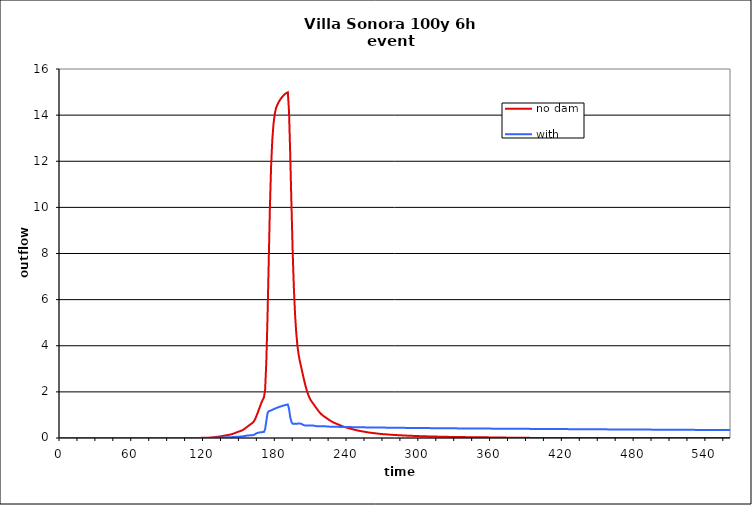
| Category | no dam | with dam |
|---|---|---|
| 0.0 | 0 | 0 |
| 1.0 | 0 | 0 |
| 2.0 | 0 | 0 |
| 3.0 | 0 | 0 |
| 4.0 | 0 | 0 |
| 5.0 | 0 | 0 |
| 6.0 | 0 | 0 |
| 7.0 | 0 | 0 |
| 8.0 | 0 | 0 |
| 9.0 | 0 | 0 |
| 10.0 | 0 | 0 |
| 11.0 | 0 | 0 |
| 12.0 | 0 | 0 |
| 13.0 | 0 | 0 |
| 14.0 | 0 | 0 |
| 15.0 | 0 | 0 |
| 16.0 | 0 | 0 |
| 17.0 | 0 | 0 |
| 18.0 | 0 | 0 |
| 19.0 | 0 | 0 |
| 20.0 | 0 | 0 |
| 21.0 | 0 | 0 |
| 22.0 | 0 | 0 |
| 23.0 | 0 | 0 |
| 24.0 | 0 | 0 |
| 25.0 | 0 | 0 |
| 26.0 | 0 | 0 |
| 27.0 | 0 | 0 |
| 28.0 | 0 | 0 |
| 29.0 | 0 | 0 |
| 30.0 | 0 | 0 |
| 31.0 | 0 | 0 |
| 32.0 | 0 | 0 |
| 33.0 | 0 | 0 |
| 34.0 | 0 | 0 |
| 35.0 | 0 | 0 |
| 36.0 | 0 | 0 |
| 37.0 | 0 | 0 |
| 38.0 | 0 | 0 |
| 39.0 | 0 | 0 |
| 40.0 | 0 | 0 |
| 41.0 | 0 | 0 |
| 42.0 | 0 | 0 |
| 43.0 | 0 | 0 |
| 44.0 | 0 | 0 |
| 45.0 | 0 | 0 |
| 46.0 | 0 | 0 |
| 47.0 | 0 | 0 |
| 48.0 | 0 | 0 |
| 49.0 | 0 | 0 |
| 50.0 | 0 | 0 |
| 51.0 | 0 | 0 |
| 52.0 | 0 | 0 |
| 53.0 | 0 | 0 |
| 54.0 | 0 | 0 |
| 55.0 | 0 | 0 |
| 56.0 | 0 | 0 |
| 57.0 | 0 | 0 |
| 58.0 | 0 | 0 |
| 59.0 | 0 | 0 |
| 60.0 | 0 | 0 |
| 61.0 | 0 | 0 |
| 62.0 | 0 | 0 |
| 63.0 | 0 | 0 |
| 64.0 | 0 | 0 |
| 65.0 | 0 | 0 |
| 66.0 | 0 | 0 |
| 67.0 | 0 | 0 |
| 68.0 | 0 | 0 |
| 69.0 | 0 | 0 |
| 70.0 | 0 | 0 |
| 71.0 | 0 | 0 |
| 72.0 | 0 | 0 |
| 73.0 | 0 | 0 |
| 74.0 | 0 | 0 |
| 75.0 | 0 | 0 |
| 76.0 | 0 | 0 |
| 77.0 | 0 | 0 |
| 78.0 | 0 | 0 |
| 79.0 | 0 | 0 |
| 80.0 | 0 | 0 |
| 81.0 | 0 | 0 |
| 82.0 | 0 | 0 |
| 83.0 | 0 | 0 |
| 84.0 | 0 | 0 |
| 85.0 | 0 | 0 |
| 86.0 | 0 | 0 |
| 87.0 | 0 | 0 |
| 88.0 | 0 | 0 |
| 89.0 | 0 | 0 |
| 90.0 | 0 | 0 |
| 91.0 | 0 | 0 |
| 92.0 | 0 | 0 |
| 93.0 | 0 | 0 |
| 94.0 | 0 | 0 |
| 95.0 | 0 | 0 |
| 96.0 | 0 | 0 |
| 97.0 | 0 | 0 |
| 98.0 | 0 | 0 |
| 99.0 | 0 | 0 |
| 100.0 | 0 | 0 |
| 101.0 | 0 | 0 |
| 102.0 | 0 | 0 |
| 103.0 | 0 | 0 |
| 104.0 | 0 | 0 |
| 105.0 | 0 | 0 |
| 106.0 | 0 | 0 |
| 107.0 | 0 | 0 |
| 108.0 | 0 | 0 |
| 109.0 | 0 | 0 |
| 110.0 | 0 | 0 |
| 111.0 | 0 | 0 |
| 112.0 | 0 | 0 |
| 113.0 | 0 | 0 |
| 114.0 | 0 | 0 |
| 115.0 | 0 | 0 |
| 116.0 | 0.001 | 0 |
| 117.0 | 0.005 | 0 |
| 118.0 | 0.007 | 0 |
| 119.0 | 0.008 | 0 |
| 120.0 | 0.009 | 0.001 |
| 121.0 | 0.01 | 0.001 |
| 122.0 | 0.011 | 0.001 |
| 123.0 | 0.013 | 0.002 |
| 124.0 | 0.016 | 0.002 |
| 125.0 | 0.019 | 0.003 |
| 126.0 | 0.023 | 0.004 |
| 127.0 | 0.028 | 0.006 |
| 128.0 | 0.034 | 0.007 |
| 129.0 | 0.04 | 0.009 |
| 130.0 | 0.046 | 0.011 |
| 131.0 | 0.053 | 0.013 |
| 132.0 | 0.059 | 0.014 |
| 133.0 | 0.066 | 0.016 |
| 134.0 | 0.074 | 0.018 |
| 135.0 | 0.082 | 0.02 |
| 136.0 | 0.092 | 0.022 |
| 137.0 | 0.102 | 0.024 |
| 138.0 | 0.112 | 0.026 |
| 139.0 | 0.121 | 0.027 |
| 140.0 | 0.13 | 0.029 |
| 141.0 | 0.139 | 0.031 |
| 142.0 | 0.15 | 0.033 |
| 143.0 | 0.164 | 0.037 |
| 144.0 | 0.18 | 0.04 |
| 145.0 | 0.2 | 0.045 |
| 146.0 | 0.22 | 0.049 |
| 147.0 | 0.241 | 0.053 |
| 148.0 | 0.261 | 0.056 |
| 149.0 | 0.279 | 0.059 |
| 150.0 | 0.296 | 0.061 |
| 151.0 | 0.315 | 0.064 |
| 152.0 | 0.337 | 0.07 |
| 153.0 | 0.368 | 0.078 |
| 154.0 | 0.405 | 0.088 |
| 155.0 | 0.446 | 0.097 |
| 156.0 | 0.486 | 0.105 |
| 157.0 | 0.525 | 0.111 |
| 158.0 | 0.564 | 0.115 |
| 159.0 | 0.602 | 0.118 |
| 160.0 | 0.637 | 0.121 |
| 161.0 | 0.682 | 0.129 |
| 162.0 | 0.753 | 0.149 |
| 163.0 | 0.86 | 0.177 |
| 164.0 | 0.988 | 0.206 |
| 165.0 | 1.122 | 0.227 |
| 166.0 | 1.264 | 0.238 |
| 167.0 | 1.407 | 0.245 |
| 168.0 | 1.54 | 0.251 |
| 169.0 | 1.66 | 0.257 |
| 170.0 | 1.763 | 0.262 |
| 171.0 | 2.086 | 0.383 |
| 172.0 | 3.307 | 0.732 |
| 173.0 | 5.241 | 1.079 |
| 174.0 | 7.619 | 1.162 |
| 175.0 | 10.007 | 1.179 |
| 176.0 | 11.795 | 1.198 |
| 177.0 | 12.93 | 1.22 |
| 178.0 | 13.618 | 1.244 |
| 179.0 | 14.037 | 1.268 |
| 180.0 | 14.281 | 1.291 |
| 181.0 | 14.426 | 1.312 |
| 182.0 | 14.532 | 1.332 |
| 183.0 | 14.622 | 1.351 |
| 184.0 | 14.7 | 1.368 |
| 185.0 | 14.774 | 1.385 |
| 186.0 | 14.836 | 1.401 |
| 187.0 | 14.888 | 1.416 |
| 188.0 | 14.932 | 1.429 |
| 189.0 | 14.965 | 1.441 |
| 190.0 | 14.99 | 1.453 |
| 191.0 | 14.126 | 1.257 |
| 192.0 | 12.256 | 0.9 |
| 193.0 | 10.151 | 0.695 |
| 194.0 | 8.138 | 0.624 |
| 195.0 | 6.538 | 0.611 |
| 196.0 | 5.378 | 0.614 |
| 197.0 | 4.569 | 0.619 |
| 198.0 | 4.008 | 0.623 |
| 199.0 | 3.617 | 0.626 |
| 200.0 | 3.335 | 0.629 |
| 201.0 | 3.11 | 0.619 |
| 202.0 | 2.874 | 0.592 |
| 203.0 | 2.643 | 0.565 |
| 204.0 | 2.421 | 0.548 |
| 205.0 | 2.215 | 0.541 |
| 206.0 | 2.033 | 0.541 |
| 207.0 | 1.88 | 0.542 |
| 208.0 | 1.755 | 0.543 |
| 209.0 | 1.655 | 0.544 |
| 210.0 | 1.575 | 0.545 |
| 211.0 | 1.505 | 0.542 |
| 212.0 | 1.431 | 0.532 |
| 213.0 | 1.356 | 0.521 |
| 214.0 | 1.282 | 0.514 |
| 215.0 | 1.212 | 0.51 |
| 216.0 | 1.145 | 0.508 |
| 217.0 | 1.085 | 0.508 |
| 218.0 | 1.032 | 0.508 |
| 219.0 | 0.986 | 0.509 |
| 220.0 | 0.947 | 0.51 |
| 221.0 | 0.911 | 0.508 |
| 222.0 | 0.876 | 0.504 |
| 223.0 | 0.839 | 0.498 |
| 224.0 | 0.803 | 0.494 |
| 225.0 | 0.768 | 0.491 |
| 226.0 | 0.736 | 0.49 |
| 227.0 | 0.706 | 0.489 |
| 228.0 | 0.678 | 0.489 |
| 229.0 | 0.653 | 0.49 |
| 230.0 | 0.631 | 0.49 |
| 231.0 | 0.61 | 0.489 |
| 232.0 | 0.589 | 0.486 |
| 233.0 | 0.568 | 0.483 |
| 234.0 | 0.546 | 0.48 |
| 235.0 | 0.525 | 0.478 |
| 236.0 | 0.504 | 0.477 |
| 237.0 | 0.486 | 0.476 |
| 238.0 | 0.468 | 0.476 |
| 239.0 | 0.452 | 0.476 |
| 240.0 | 0.438 | 0.476 |
| 241.0 | 0.424 | 0.476 |
| 242.0 | 0.41 | 0.474 |
| 243.0 | 0.396 | 0.472 |
| 244.0 | 0.382 | 0.47 |
| 245.0 | 0.368 | 0.468 |
| 246.0 | 0.354 | 0.467 |
| 247.0 | 0.342 | 0.467 |
| 248.0 | 0.33 | 0.466 |
| 249.0 | 0.319 | 0.466 |
| 250.0 | 0.309 | 0.466 |
| 251.0 | 0.3 | 0.465 |
| 252.0 | 0.29 | 0.464 |
| 253.0 | 0.281 | 0.463 |
| 254.0 | 0.271 | 0.461 |
| 255.0 | 0.262 | 0.46 |
| 256.0 | 0.253 | 0.459 |
| 257.0 | 0.244 | 0.459 |
| 258.0 | 0.236 | 0.458 |
| 259.0 | 0.229 | 0.458 |
| 260.0 | 0.222 | 0.458 |
| 261.0 | 0.216 | 0.457 |
| 262.0 | 0.21 | 0.456 |
| 263.0 | 0.204 | 0.455 |
| 264.0 | 0.198 | 0.454 |
| 265.0 | 0.191 | 0.453 |
| 266.0 | 0.185 | 0.453 |
| 267.0 | 0.18 | 0.452 |
| 268.0 | 0.175 | 0.451 |
| 269.0 | 0.17 | 0.451 |
| 270.0 | 0.166 | 0.451 |
| 271.0 | 0.162 | 0.45 |
| 272.0 | 0.158 | 0.45 |
| 273.0 | 0.154 | 0.449 |
| 274.0 | 0.15 | 0.448 |
| 275.0 | 0.146 | 0.447 |
| 276.0 | 0.142 | 0.446 |
| 277.0 | 0.138 | 0.446 |
| 278.0 | 0.135 | 0.445 |
| 279.0 | 0.132 | 0.445 |
| 280.0 | 0.129 | 0.444 |
| 281.0 | 0.126 | 0.444 |
| 282.0 | 0.123 | 0.443 |
| 283.0 | 0.12 | 0.442 |
| 284.0 | 0.118 | 0.442 |
| 285.0 | 0.115 | 0.441 |
| 286.0 | 0.112 | 0.44 |
| 287.0 | 0.109 | 0.44 |
| 288.0 | 0.106 | 0.439 |
| 289.0 | 0.104 | 0.439 |
| 290.0 | 0.102 | 0.438 |
| 291.0 | 0.099 | 0.438 |
| 292.0 | 0.097 | 0.437 |
| 293.0 | 0.095 | 0.436 |
| 294.0 | 0.093 | 0.436 |
| 295.0 | 0.091 | 0.435 |
| 296.0 | 0.089 | 0.434 |
| 297.0 | 0.087 | 0.434 |
| 298.0 | 0.085 | 0.433 |
| 299.0 | 0.083 | 0.433 |
| 300.0 | 0.081 | 0.433 |
| 301.0 | 0.079 | 0.432 |
| 302.0 | 0.078 | 0.432 |
| 303.0 | 0.076 | 0.431 |
| 304.0 | 0.074 | 0.43 |
| 305.0 | 0.073 | 0.43 |
| 306.0 | 0.071 | 0.429 |
| 307.0 | 0.07 | 0.429 |
| 308.0 | 0.068 | 0.429 |
| 309.0 | 0.067 | 0.428 |
| 310.0 | 0.066 | 0.428 |
| 311.0 | 0.064 | 0.427 |
| 312.0 | 0.063 | 0.427 |
| 313.0 | 0.062 | 0.426 |
| 314.0 | 0.061 | 0.425 |
| 315.0 | 0.059 | 0.425 |
| 316.0 | 0.058 | 0.424 |
| 317.0 | 0.057 | 0.424 |
| 318.0 | 0.056 | 0.423 |
| 319.0 | 0.054 | 0.423 |
| 320.0 | 0.053 | 0.422 |
| 321.0 | 0.052 | 0.422 |
| 322.0 | 0.051 | 0.421 |
| 323.0 | 0.05 | 0.421 |
| 324.0 | 0.049 | 0.42 |
| 325.0 | 0.048 | 0.42 |
| 326.0 | 0.047 | 0.419 |
| 327.0 | 0.046 | 0.419 |
| 328.0 | 0.045 | 0.419 |
| 329.0 | 0.044 | 0.418 |
| 330.0 | 0.044 | 0.418 |
| 331.0 | 0.043 | 0.418 |
| 332.0 | 0.042 | 0.417 |
| 333.0 | 0.041 | 0.417 |
| 334.0 | 0.041 | 0.416 |
| 335.0 | 0.04 | 0.416 |
| 336.0 | 0.04 | 0.415 |
| 337.0 | 0.039 | 0.415 |
| 338.0 | 0.038 | 0.415 |
| 339.0 | 0.038 | 0.414 |
| 340.0 | 0.037 | 0.414 |
| 341.0 | 0.036 | 0.414 |
| 342.0 | 0.036 | 0.413 |
| 343.0 | 0.035 | 0.413 |
| 344.0 | 0.035 | 0.412 |
| 345.0 | 0.034 | 0.412 |
| 346.0 | 0.033 | 0.412 |
| 347.0 | 0.033 | 0.411 |
| 348.0 | 0.032 | 0.411 |
| 349.0 | 0.032 | 0.41 |
| 350.0 | 0.031 | 0.41 |
| 351.0 | 0.031 | 0.41 |
| 352.0 | 0.03 | 0.409 |
| 353.0 | 0.029 | 0.409 |
| 354.0 | 0.029 | 0.409 |
| 355.0 | 0.028 | 0.408 |
| 356.0 | 0.028 | 0.408 |
| 357.0 | 0.027 | 0.407 |
| 358.0 | 0.027 | 0.407 |
| 359.0 | 0.026 | 0.407 |
| 360.0 | 0.026 | 0.406 |
| 361.0 | 0.025 | 0.406 |
| 362.0 | 0.025 | 0.405 |
| 363.0 | 0.024 | 0.405 |
| 364.0 | 0.024 | 0.405 |
| 365.0 | 0.024 | 0.404 |
| 366.0 | 0.023 | 0.404 |
| 367.0 | 0.023 | 0.404 |
| 368.0 | 0.022 | 0.404 |
| 369.0 | 0.021 | 0.403 |
| 370.0 | 0.02 | 0.403 |
| 371.0 | 0.018 | 0.403 |
| 372.0 | 0.017 | 0.402 |
| 373.0 | 0.016 | 0.402 |
| 374.0 | 0.015 | 0.402 |
| 375.0 | 0.014 | 0.401 |
| 376.0 | 0.013 | 0.401 |
| 377.0 | 0.012 | 0.401 |
| 378.0 | 0.011 | 0.4 |
| 379.0 | 0.011 | 0.4 |
| 380.0 | 0.01 | 0.4 |
| 381.0 | 0.01 | 0.399 |
| 382.0 | 0.009 | 0.399 |
| 383.0 | 0.009 | 0.399 |
| 384.0 | 0.008 | 0.398 |
| 385.0 | 0.008 | 0.398 |
| 386.0 | 0.008 | 0.398 |
| 387.0 | 0.007 | 0.397 |
| 388.0 | 0.007 | 0.397 |
| 389.0 | 0.006 | 0.397 |
| 390.0 | 0.006 | 0.396 |
| 391.0 | 0.006 | 0.396 |
| 392.0 | 0.005 | 0.396 |
| 393.0 | 0.005 | 0.395 |
| 394.0 | 0.005 | 0.395 |
| 395.0 | 0.004 | 0.395 |
| 396.0 | 0.004 | 0.394 |
| 397.0 | 0.004 | 0.394 |
| 398.0 | 0.003 | 0.394 |
| 399.0 | 0.003 | 0.393 |
| 400.0 | 0.003 | 0.393 |
| 401.0 | 0.003 | 0.393 |
| 402.0 | 0.002 | 0.392 |
| 403.0 | 0.002 | 0.392 |
| 404.0 | 0.002 | 0.392 |
| 405.0 | 0.002 | 0.391 |
| 406.0 | 0.001 | 0.391 |
| 407.0 | 0.001 | 0.391 |
| 408.0 | 0.001 | 0.39 |
| 409.0 | 0.001 | 0.39 |
| 410.0 | 0.001 | 0.39 |
| 411.0 | 0.001 | 0.389 |
| 412.0 | 0.001 | 0.389 |
| 413.0 | 0.001 | 0.389 |
| 414.0 | 0.001 | 0.388 |
| 415.0 | 0.001 | 0.388 |
| 416.0 | 0 | 0.388 |
| 417.0 | 0 | 0.387 |
| 418.0 | 0 | 0.387 |
| 419.0 | 0 | 0.387 |
| 420.0 | 0 | 0.386 |
| 421.0 | 0 | 0.386 |
| 422.0 | 0 | 0.386 |
| 423.0 | 0 | 0.385 |
| 424.0 | 0 | 0.385 |
| 425.0 | 0 | 0.385 |
| 426.0 | 0 | 0.384 |
| 427.0 | 0 | 0.384 |
| 428.0 | 0 | 0.384 |
| 429.0 | 0 | 0.383 |
| 430.0 | 0 | 0.383 |
| 431.0 | 0 | 0.383 |
| 432.0 | 0 | 0.382 |
| 433.0 | 0 | 0.382 |
| 434.0 | 0 | 0.382 |
| 435.0 | 0 | 0.381 |
| 436.0 | 0 | 0.381 |
| 437.0 | 0 | 0.381 |
| 438.0 | 0 | 0.38 |
| 439.0 | 0 | 0.38 |
| 440.0 | 0 | 0.38 |
| 441.0 | 0 | 0.379 |
| 442.0 | 0 | 0.379 |
| 443.0 | 0 | 0.379 |
| 444.0 | 0 | 0.378 |
| 445.0 | 0 | 0.378 |
| 446.0 | 0 | 0.378 |
| 447.0 | 0 | 0.377 |
| 448.0 | 0 | 0.377 |
| 449.0 | 0 | 0.377 |
| 450.0 | 0 | 0.376 |
| 451.0 | 0 | 0.376 |
| 452.0 | 0 | 0.376 |
| 453.0 | 0 | 0.375 |
| 454.0 | 0 | 0.375 |
| 455.0 | 0 | 0.375 |
| 456.0 | 0 | 0.374 |
| 457.0 | 0 | 0.374 |
| 458.0 | 0 | 0.374 |
| 459.0 | 0 | 0.373 |
| 460.0 | 0 | 0.373 |
| 461.0 | 0 | 0.373 |
| 462.0 | 0 | 0.372 |
| 463.0 | 0 | 0.372 |
| 464.0 | 0 | 0.372 |
| 465.0 | 0 | 0.371 |
| 466.0 | 0 | 0.371 |
| 467.0 | 0 | 0.371 |
| 468.0 | 0 | 0.371 |
| 469.0 | 0 | 0.37 |
| 470.0 | 0 | 0.37 |
| 471.0 | 0 | 0.37 |
| 472.0 | 0 | 0.369 |
| 473.0 | 0 | 0.369 |
| 474.0 | 0 | 0.369 |
| 475.0 | 0 | 0.369 |
| 476.0 | 0 | 0.368 |
| 477.0 | 0 | 0.368 |
| 478.0 | 0 | 0.368 |
| 479.0 | 0 | 0.367 |
| 480.0 | 0 | 0.367 |
| 481.0 | 0 | 0.367 |
| 482.0 | 0 | 0.367 |
| 483.0 | 0 | 0.366 |
| 484.0 | 0 | 0.366 |
| 485.0 | 0 | 0.366 |
| 486.0 | 0 | 0.365 |
| 487.0 | 0 | 0.365 |
| 488.0 | 0 | 0.365 |
| 489.0 | 0 | 0.364 |
| 490.0 | 0 | 0.364 |
| 491.0 | 0 | 0.364 |
| 492.0 | 0 | 0.364 |
| 493.0 | 0 | 0.363 |
| 494.0 | 0 | 0.363 |
| 495.0 | 0 | 0.363 |
| 496.0 | 0 | 0.362 |
| 497.0 | 0 | 0.362 |
| 498.0 | 0 | 0.362 |
| 499.0 | 0 | 0.362 |
| 500.0 | 0 | 0.361 |
| 501.0 | 0 | 0.361 |
| 502.0 | 0 | 0.361 |
| 503.0 | 0 | 0.36 |
| 504.0 | 0 | 0.36 |
| 505.0 | 0 | 0.36 |
| 506.0 | 0 | 0.359 |
| 507.0 | 0 | 0.359 |
| 508.0 | 0 | 0.359 |
| 509.0 | 0 | 0.359 |
| 510.0 | 0 | 0.358 |
| 511.0 | 0 | 0.358 |
| 512.0 | 0 | 0.358 |
| 513.0 | 0 | 0.357 |
| 514.0 | 0 | 0.357 |
| 515.0 | 0 | 0.357 |
| 516.0 | 0 | 0.357 |
| 517.0 | 0 | 0.356 |
| 518.0 | 0 | 0.356 |
| 519.0 | 0 | 0.356 |
| 520.0 | 0 | 0.355 |
| 521.0 | 0 | 0.355 |
| 522.0 | 0 | 0.355 |
| 523.0 | 0 | 0.354 |
| 524.0 | 0 | 0.354 |
| 525.0 | 0 | 0.354 |
| 526.0 | 0 | 0.354 |
| 527.0 | 0 | 0.353 |
| 528.0 | 0 | 0.353 |
| 529.0 | 0 | 0.353 |
| 530.0 | 0 | 0.352 |
| 531.0 | 0 | 0.352 |
| 532.0 | 0 | 0.352 |
| 533.0 | 0 | 0.352 |
| 534.0 | 0 | 0.351 |
| 535.0 | 0 | 0.351 |
| 536.0 | 0 | 0.351 |
| 537.0 | 0 | 0.35 |
| 538.0 | 0 | 0.35 |
| 539.0 | 0 | 0.35 |
| 540.0 | 0 | 0.349 |
| 541.0 | 0 | 0.349 |
| 542.0 | 0 | 0.349 |
| 543.0 | 0 | 0.349 |
| 544.0 | 0 | 0.348 |
| 545.0 | 0 | 0.348 |
| 546.0 | 0 | 0.348 |
| 547.0 | 0 | 0.347 |
| 548.0 | 0 | 0.347 |
| 549.0 | 0 | 0.347 |
| 550.0 | 0 | 0.347 |
| 551.0 | 0 | 0.346 |
| 552.0 | 0 | 0.346 |
| 553.0 | 0 | 0.346 |
| 554.0 | 0 | 0.345 |
| 555.0 | 0 | 0.345 |
| 556.0 | 0 | 0.345 |
| 557.0 | 0 | 0.345 |
| 558.0 | 0 | 0.344 |
| 559.0 | 0 | 0.344 |
| 560.0 | 0 | 0.344 |